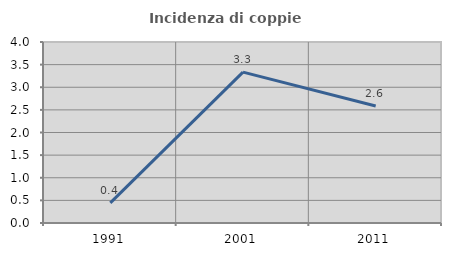
| Category | Incidenza di coppie miste |
|---|---|
| 1991.0 | 0.446 |
| 2001.0 | 3.333 |
| 2011.0 | 2.584 |